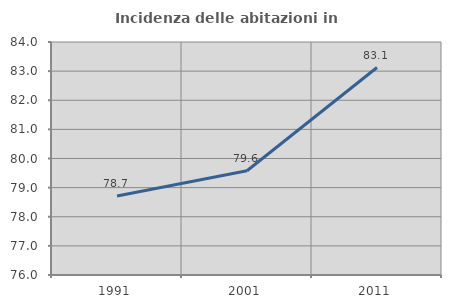
| Category | Incidenza delle abitazioni in proprietà  |
|---|---|
| 1991.0 | 78.715 |
| 2001.0 | 79.579 |
| 2011.0 | 83.124 |